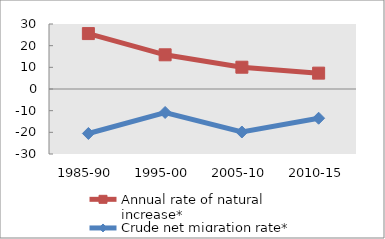
| Category | Annual rate of natural increase* | Crude net migration rate* |
|---|---|---|
| 1985-90 | 25.578 | -20.53 |
| 1995-00 | 15.782 | -10.838 |
| 2005-10 | 10.054 | -19.848 |
| 2010-15 | 7.321 | -13.489 |